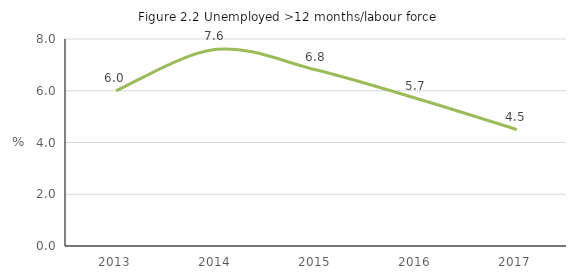
| Category | >12 months/labour force |
|---|---|
| 2013.0 | 6 |
| 2014.0 | 7.6 |
| 2015.0 | 6.8 |
| 2016.0 | 5.7 |
| 2017.0 | 4.5 |